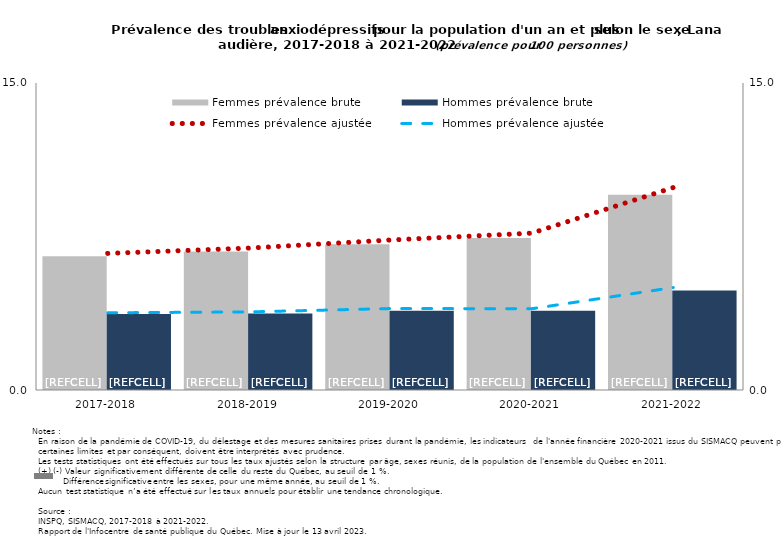
| Category | Femmes prévalence brute | Hommes prévalence brute |
|---|---|---|
| 2017-2018 | 6.538 | 3.712 |
| 2018-2019 | 6.767 | 3.737 |
| 2019-2020 | 7.116 | 3.875 |
| 2020-2021 | 7.422 | 3.874 |
| 2021-2022 | 9.545 | 4.867 |